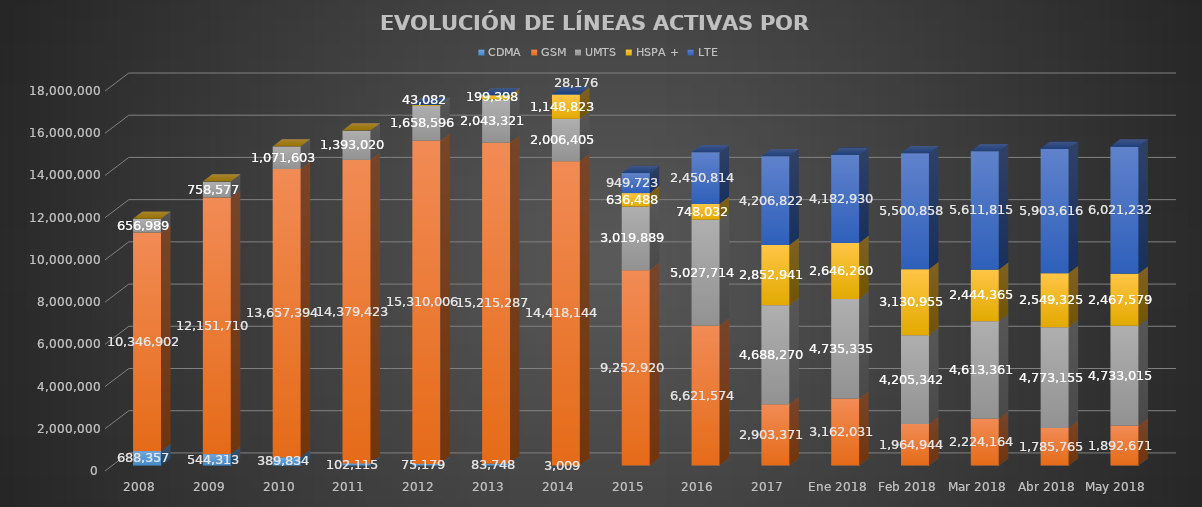
| Category | CDMA | GSM | UMTS | HSPA + | LTE |
|---|---|---|---|---|---|
| 2008 | 688357 | 10346902 | 656989 | 0 | 0 |
| 2009 | 544313 | 12151710 | 758577 | 0 | 0 |
| 2010 | 389834 | 13657394 | 1071603 | 0 | 0 |
| 2011 | 102115 | 14379423 | 1393020 | 0 | 0 |
| 2012 | 75179 | 15310006 | 1658596 | 43082 | 0 |
| 2013 | 83748 | 15215287 | 2043321 | 199398 | 0 |
| 2014 | 3009 | 14418144 | 2006405 | 1148823 | 28176 |
| 2015 | 0 | 9252920 | 3019889 | 636488 | 949723 |
| 2016 | 0 | 6621574 | 5027714 | 748032 | 2450814 |
| 2017 | 0 | 2903370.634 | 4688270.066 | 2852941.199 | 4206822.101 |
| Ene 2018 | 0 | 3162031.234 | 4735334.541 | 2646260.354 | 4182929.87 |
| Feb 2018 | 0 | 1964943.811 | 4205341.79 | 3130954.977 | 5500858.422 |
| Mar 2018 | 0 | 2224163.855 | 4613360.532 | 2444365 | 5611814.614 |
| Abr 2018 | 0 | 1785764.931 | 4773155.2 | 2549325 | 5903615.869 |
| May 2018 | 0 | 1892670.914 | 4733014.971 | 2467579 | 6021232.116 |